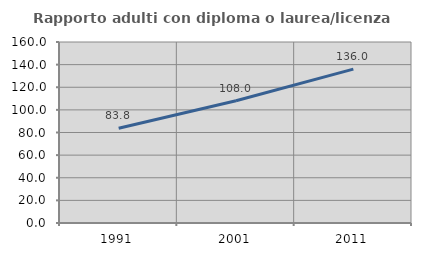
| Category | Rapporto adulti con diploma o laurea/licenza media  |
|---|---|
| 1991.0 | 83.821 |
| 2001.0 | 108.012 |
| 2011.0 | 135.983 |